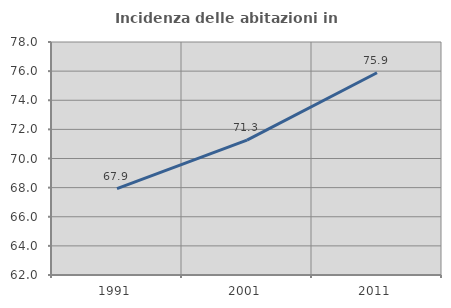
| Category | Incidenza delle abitazioni in proprietà  |
|---|---|
| 1991.0 | 67.935 |
| 2001.0 | 71.265 |
| 2011.0 | 75.888 |